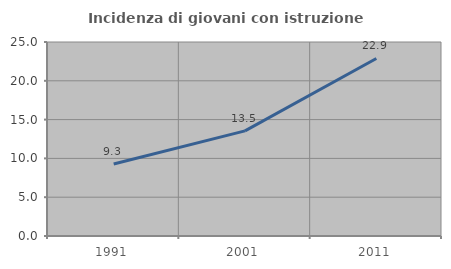
| Category | Incidenza di giovani con istruzione universitaria |
|---|---|
| 1991.0 | 9.269 |
| 2001.0 | 13.546 |
| 2011.0 | 22.881 |